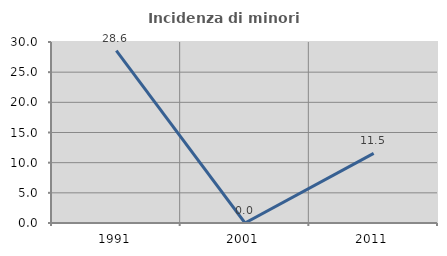
| Category | Incidenza di minori stranieri |
|---|---|
| 1991.0 | 28.571 |
| 2001.0 | 0 |
| 2011.0 | 11.538 |